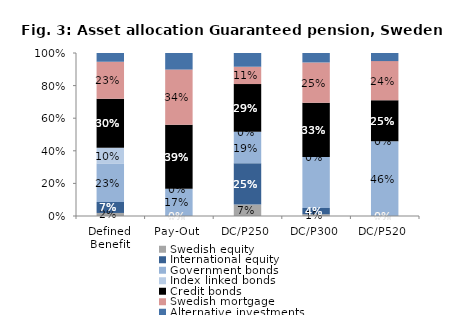
| Category | Swedish equity | International equity | Government bonds | Index linked bonds | Credit bonds | Swedish mortgage | Alternative investments |
|---|---|---|---|---|---|---|---|
| Defined Benefit | 0.019 | 0.067 | 0.234 | 0.098 | 0.301 | 0.227 | 0.054 |
| Pay-Out | 0 | 0 | 0.167 | 0 | 0.392 | 0.339 | 0.102 |
| DC/P250 | 0.07 | 0.253 | 0.194 | 0 | 0.293 | 0.106 | 0.084 |
| DC/P300 | 0.011 | 0.039 | 0.313 | 0 | 0.333 | 0.247 | 0.058 |
| DC/P520 | 0 | 0.001 | 0.458 | 0 | 0.251 | 0.241 | 0.05 |